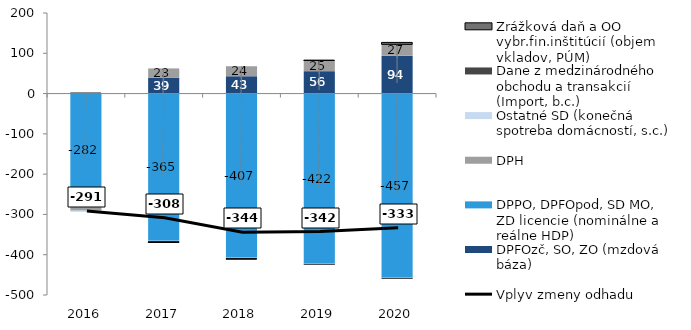
| Category | DPFOzč, SO, ZO (mzdová báza) | DPPO, DPFOpod, SD MO, ZD licencie (nominálne a reálne HDP) | DPH | Ostatné SD (konečná spotreba domácností, s.c.) | Dane z medzinárodného obchodu a transakcií (Import, b.c.) | Zrážková daň a OO vybr.fin.inštitúcií (objem vkladov, PÚM) |
|---|---|---|---|---|---|---|
| 2016.0 | -0.329 | -281.785 | -7.212 | -1.813 | -0.321 | 0.227 |
| 2017.0 | 38.961 | -365.427 | 23.481 | -0.62 | -2.359 | -2.469 |
| 2018.0 | 43.19 | -407.417 | 24.438 | -0.614 | -2.476 | -1.264 |
| 2019.0 | 55.544 | -422.183 | 25.494 | -0.606 | -2.575 | 1.846 |
| 2020.0 | 94.144 | -456.936 | 26.83 | -0.603 | -2.657 | 6.027 |